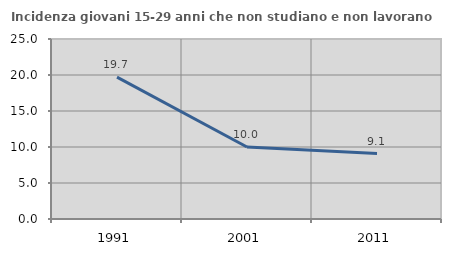
| Category | Incidenza giovani 15-29 anni che non studiano e non lavorano  |
|---|---|
| 1991.0 | 19.705 |
| 2001.0 | 10 |
| 2011.0 | 9.091 |